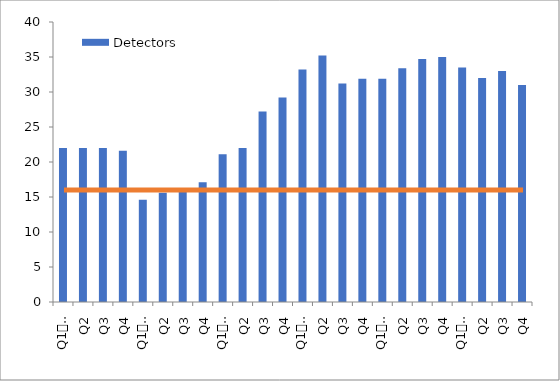
| Category | Detectors |
|---|---|
| 0 | 22 |
| 1 | 22 |
| 2 | 22 |
| 3 | 21.6 |
| 4 | 14.6 |
| 5 | 15.6 |
| 6 | 16.1 |
| 7 | 17.1 |
| 8 | 21.1 |
| 9 | 22 |
| 10 | 27.2 |
| 11 | 29.2 |
| 12 | 33.2 |
| 13 | 35.2 |
| 14 | 31.2 |
| 15 | 31.9 |
| 16 | 31.9 |
| 17 | 33.41 |
| 18 | 34.7 |
| 19 | 35 |
| 20 | 33.5 |
| 21 | 32 |
| 22 | 33 |
| 23 | 31 |